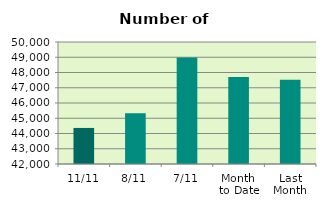
| Category | Series 0 |
|---|---|
| 11/11 | 44364 |
| 8/11 | 45328 |
| 7/11 | 48976 |
| Month 
to Date | 47698.286 |
| Last
Month | 47528 |